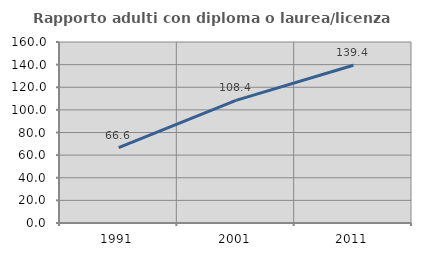
| Category | Rapporto adulti con diploma o laurea/licenza media  |
|---|---|
| 1991.0 | 66.556 |
| 2001.0 | 108.356 |
| 2011.0 | 139.44 |